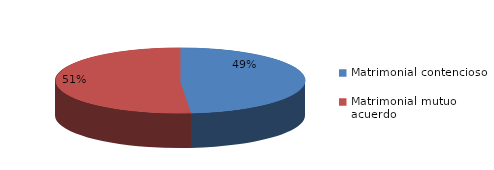
| Category | Series 0 |
|---|---|
| 0 | 665 |
| 1 | 703 |